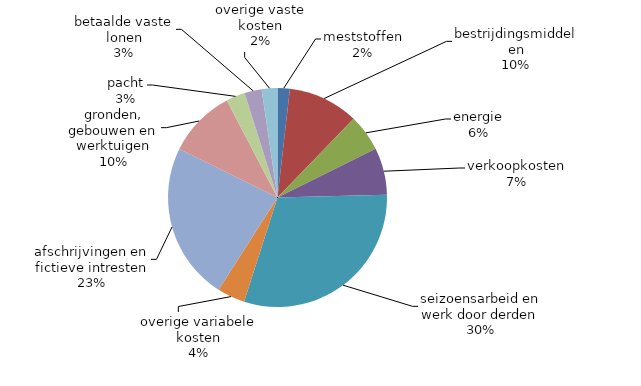
| Category | 2018* |
|---|---|
| meststoffen | 6081.676 |
| bestrijdingsmiddelen | 34916.227 |
| energie | 18265.422 |
| verkoopkosten | 23276.63 |
| seizoensarbeid en werk door derden | 101696.422 |
| overige variabele kosten | 13761.706 |
| afschrijvingen en fictieve intresten | 77919.954 |
| gronden, gebouwen en werktuigen | 33712.6 |
| pacht | 9410.829 |
| betaalde vaste lonen | 8513.922 |
| overige vaste kosten | 7771.618 |